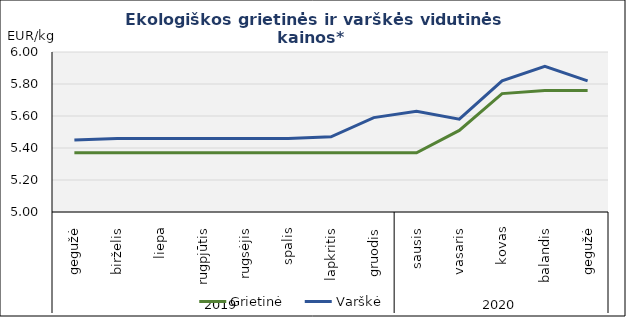
| Category | Grietinė | Varškė |
|---|---|---|
| 0 | 5.37 | 5.45 |
| 1 | 5.37 | 5.46 |
| 2 | 5.37 | 5.46 |
| 3 | 5.37 | 5.46 |
| 4 | 5.37 | 5.46 |
| 5 | 5.37 | 5.46 |
| 6 | 5.37 | 5.47 |
| 7 | 5.37 | 5.59 |
| 8 | 5.37 | 5.63 |
| 9 | 5.51 | 5.58 |
| 10 | 5.74 | 5.82 |
| 11 | 5.76 | 5.91 |
| 12 | 5.76 | 5.82 |